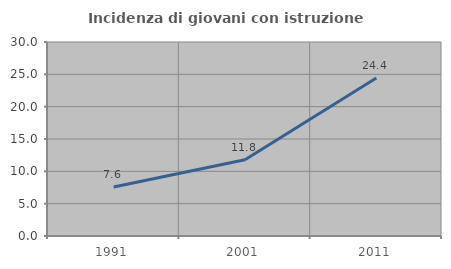
| Category | Incidenza di giovani con istruzione universitaria |
|---|---|
| 1991.0 | 7.568 |
| 2001.0 | 11.778 |
| 2011.0 | 24.426 |